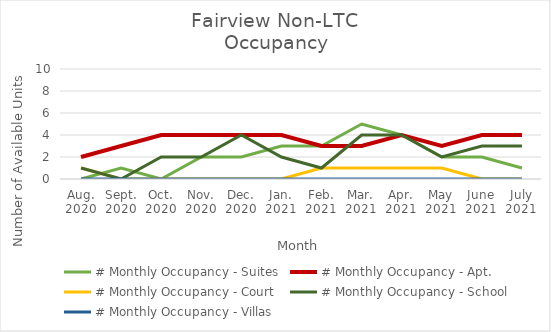
| Category | # Monthly Occupancy - Suites | # Monthly Occupancy - Apt. | # Monthly Occupancy - Court | # Monthly Occupancy - School | # Monthly Occupancy - Villas |
|---|---|---|---|---|---|
| Aug.
2020 | 0 | 2 | 1 | 1 | 0 |
| Sept.
2020 | 1 | 3 | 0 | 0 | 0 |
| Oct.
2020 | 0 | 4 | 0 | 2 | 0 |
| Nov.
2020 | 2 | 4 | 0 | 2 | 0 |
| Dec.
2020 | 2 | 4 | 0 | 4 | 0 |
| Jan.
2021 | 3 | 4 | 0 | 2 | 0 |
| Feb.
2021 | 3 | 3 | 1 | 1 | 0 |
| Mar.
2021 | 5 | 3 | 1 | 4 | 0 |
| Apr.
2021 | 4 | 4 | 1 | 4 | 0 |
| May
2021 | 2 | 3 | 1 | 2 | 0 |
| June
2021 | 2 | 4 | 0 | 3 | 0 |
| July
2021 | 1 | 4 | 0 | 3 | 0 |